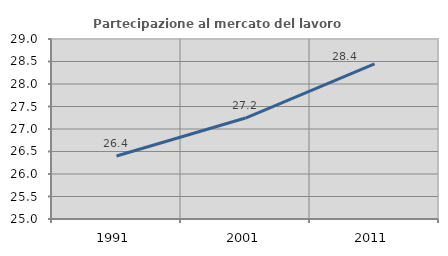
| Category | Partecipazione al mercato del lavoro  femminile |
|---|---|
| 1991.0 | 26.4 |
| 2001.0 | 27.244 |
| 2011.0 | 28.447 |